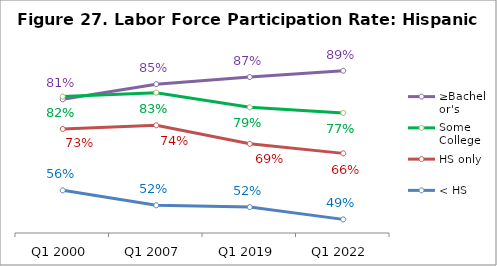
| Category | ≥Bachelor's | Some College | HS only | < HS |
|---|---|---|---|---|
| Q1 2000 | 0.809 | 0.817 | 0.73 | 0.565 |
| Q1 2007 | 0.85 | 0.827 | 0.74 | 0.525 |
| Q1 2019 | 0.869 | 0.788 | 0.69 | 0.52 |
| Q1 2022 | 0.886 | 0.773 | 0.664 | 0.487 |